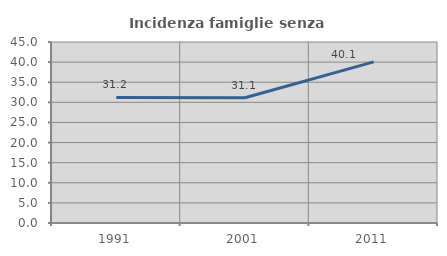
| Category | Incidenza famiglie senza nuclei |
|---|---|
| 1991.0 | 31.233 |
| 2001.0 | 31.138 |
| 2011.0 | 40.056 |